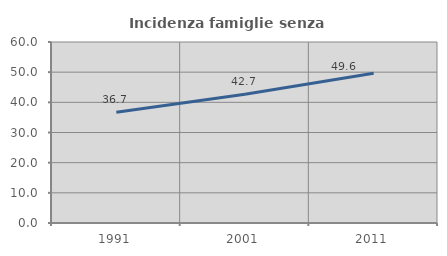
| Category | Incidenza famiglie senza nuclei |
|---|---|
| 1991.0 | 36.741 |
| 2001.0 | 42.688 |
| 2011.0 | 49.614 |